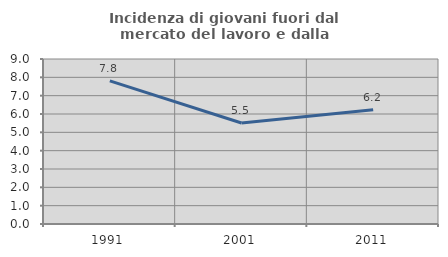
| Category | Incidenza di giovani fuori dal mercato del lavoro e dalla formazione  |
|---|---|
| 1991.0 | 7.803 |
| 2001.0 | 5.51 |
| 2011.0 | 6.228 |